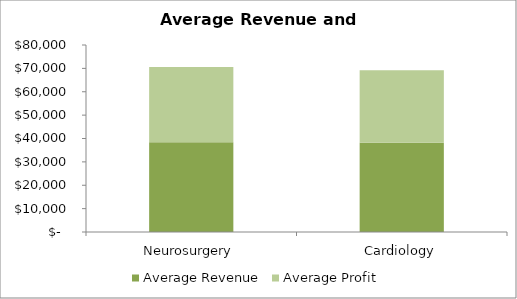
| Category | Average Revenue | Average Profit |
|---|---|---|
| Neurosurgery | 38377.902 | 32172.382 |
| Cardiology | 38151.925 | 31078.723 |